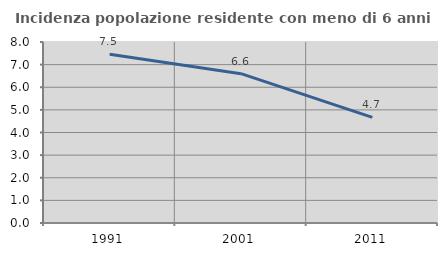
| Category | Incidenza popolazione residente con meno di 6 anni |
|---|---|
| 1991.0 | 7.459 |
| 2001.0 | 6.6 |
| 2011.0 | 4.672 |